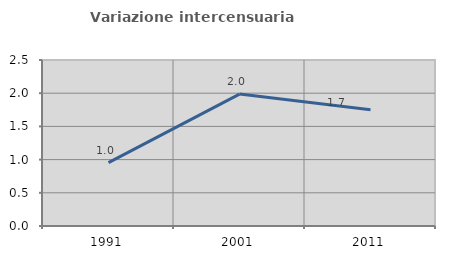
| Category | Variazione intercensuaria annua |
|---|---|
| 1991.0 | 0.956 |
| 2001.0 | 1.987 |
| 2011.0 | 1.75 |